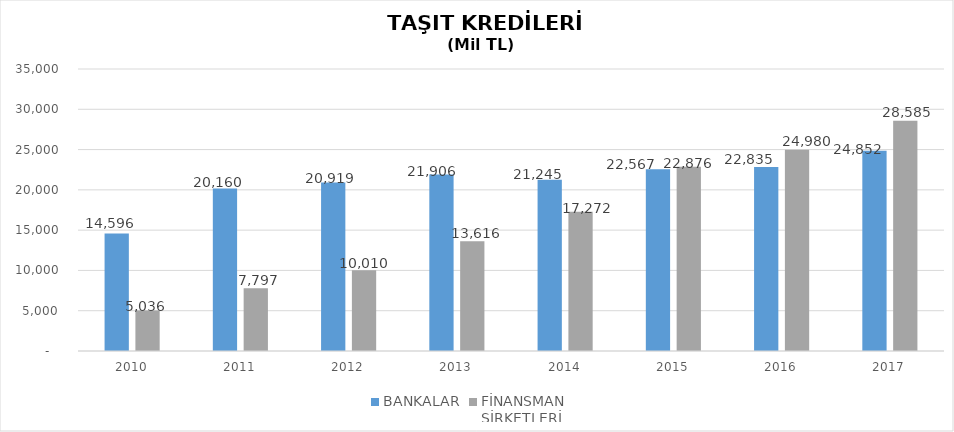
| Category | BANKALAR | FİNANSMAN 
ŞİRKETLERİ |
|---|---|---|
| 2010 | 14596 | 5035.89 |
| 2011 | 20160 | 7796.854 |
| 2012 | 20919 | 10009.755 |
| 2013 | 21906 | 13616.036 |
| 2014 | 21245 | 17271.844 |
| 2015 | 22567 | 22875.563 |
| 2016 | 22835 | 24980.231 |
| 2017 | 24852 | 28584.938 |